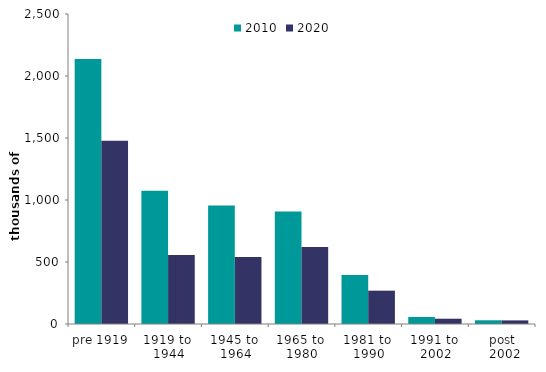
| Category | 2010 | 2020 |
|---|---|---|
| pre 1919 | 2136.172 | 1478.78 |
| 1919 to 
1944 | 1075.407 | 556.06 |
| 1945 to 
1964 | 955.75 | 540.986 |
| 1965 to 
1980 | 907.66 | 620.349 |
| 1981 to 
1990 | 395.991 | 268.775 |
| 1991 to 
2002 | 56.381 | 42.611 |
| post
 2002 | 30.028 | 29.133 |